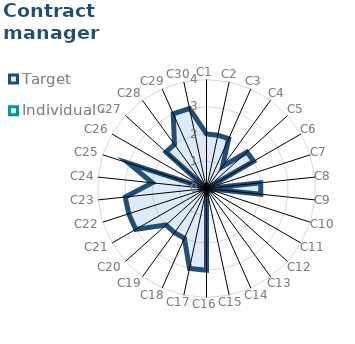
| Category | Target | Individual 4 |
|---|---|---|
| C1 | 2 | 0 |
| C2 | 2 | 0 |
| C3 | 2 | 0 |
| C4 | 1 | 0 |
| C5 | 2 | 0 |
| C6 | 2 | 0 |
| C7 | 0 | 0 |
| C8 | 2 | 0 |
| C9 | 2 | 0 |
| C10 | 0 | 0 |
| C11 | 0 | 0 |
| C12 | 0 | 0 |
| C13 | 0 | 0 |
| C14 | 0 | 0 |
| C15 | 0 | 0 |
| C16 | 3 | 0 |
| C17 | 3 | 0 |
| C18 | 2 | 0 |
| C19 | 2 | 0 |
| C20 | 2 | 0 |
| C21 | 3 | 0 |
| C22 | 3 | 0 |
| C23 | 3 | 0 |
| C24 | 2 | 0 |
| C25 | 3 | 0 |
| C26 | 0 | 0 |
| C27 | 2 | 0 |
| C28 | 2 | 0 |
| C29 | 3 | 0 |
| C30 | 3 | 0 |